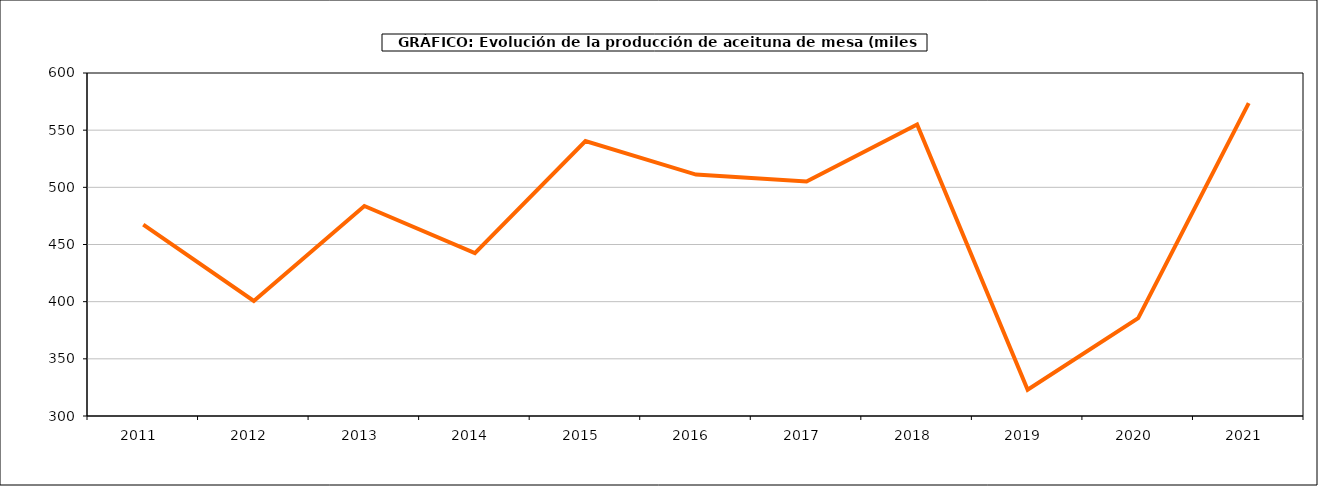
| Category | producción |
|---|---|
| 2011.0 | 467.363 |
| 2012.0 | 400.651 |
| 2013.0 | 483.713 |
| 2014.0 | 442.478 |
| 2015.0 | 540.484 |
| 2016.0 | 511.122 |
| 2017.0 | 505.046 |
| 2018.0 | 555.033 |
| 2019.0 | 323.021 |
| 2020.0 | 385.57 |
| 2021.0 | 573.666 |